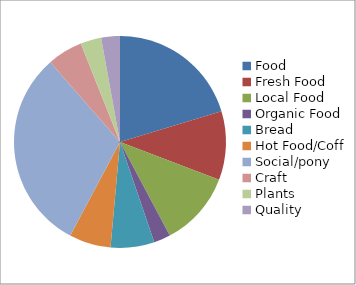
| Category | Series 0 |
|---|---|
| Food | 64 |
| Fresh Food | 33 |
| Local Food | 36 |
| Organic Food | 8 |
| Bread | 21 |
| Hot Food/Coff | 20 |
| Social/pony | 97 |
| Craft | 17 |
| Plants | 10 |
| Quality | 9 |